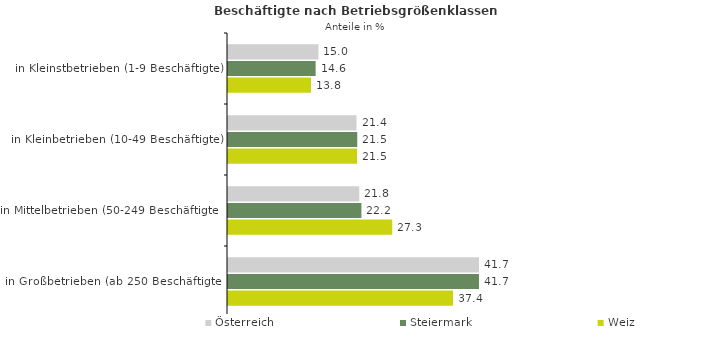
| Category | Österreich | Steiermark | Weiz |
|---|---|---|---|
| in Kleinstbetrieben (1-9 Beschäftigte) | 15.046 | 14.574 | 13.8 |
| in Kleinbetrieben (10-49 Beschäftigte) | 21.375 | 21.498 | 21.454 |
| in Mittelbetrieben (50-249 Beschäftigte) | 21.831 | 22.187 | 27.315 |
| in Großbetrieben (ab 250 Beschäftigte) | 41.748 | 41.742 | 37.432 |